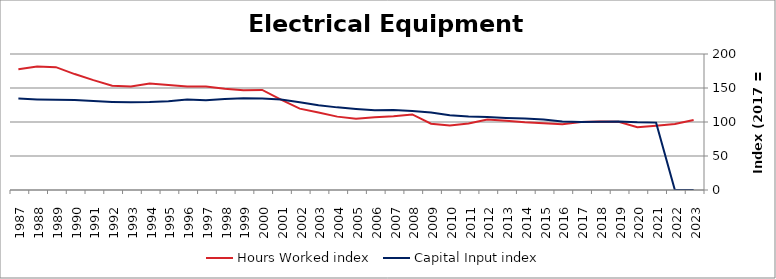
| Category | Hours Worked index | Capital Input index |
|---|---|---|
| 2023.0 | 102.975 | 0 |
| 2022.0 | 96.996 | 0 |
| 2021.0 | 94.572 | 99.095 |
| 2020.0 | 92.218 | 99.672 |
| 2019.0 | 100.239 | 100.862 |
| 2018.0 | 100.781 | 100.364 |
| 2017.0 | 100 | 100 |
| 2016.0 | 96.692 | 100.868 |
| 2015.0 | 98.327 | 103.604 |
| 2014.0 | 99.609 | 104.988 |
| 2013.0 | 101.747 | 106.063 |
| 2012.0 | 103.757 | 107.383 |
| 2011.0 | 97.801 | 108.149 |
| 2010.0 | 94.799 | 109.963 |
| 2009.0 | 97.555 | 113.832 |
| 2008.0 | 111.144 | 116.28 |
| 2007.0 | 108.299 | 117.638 |
| 2006.0 | 107.129 | 117.416 |
| 2005.0 | 104.652 | 119.29 |
| 2004.0 | 107.895 | 121.515 |
| 2003.0 | 114.024 | 124.772 |
| 2002.0 | 119.677 | 129.171 |
| 2001.0 | 132.866 | 133.161 |
| 2000.0 | 147.196 | 134.73 |
| 1999.0 | 146.7 | 135.024 |
| 1998.0 | 149.042 | 133.659 |
| 1997.0 | 152.069 | 132.125 |
| 1996.0 | 152.097 | 132.936 |
| 1995.0 | 154.237 | 130.666 |
| 1994.0 | 156.591 | 129.322 |
| 1993.0 | 152.14 | 128.925 |
| 1992.0 | 153.298 | 129.575 |
| 1991.0 | 161.519 | 130.807 |
| 1990.0 | 170.494 | 132.417 |
| 1989.0 | 180.641 | 132.656 |
| 1988.0 | 181.585 | 133.263 |
| 1987.0 | 177.606 | 134.443 |